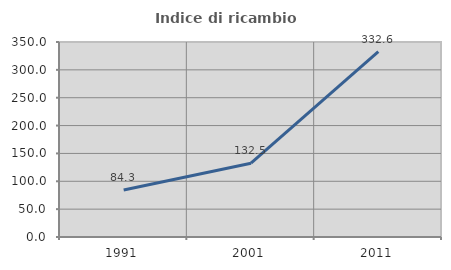
| Category | Indice di ricambio occupazionale  |
|---|---|
| 1991.0 | 84.334 |
| 2001.0 | 132.457 |
| 2011.0 | 332.592 |